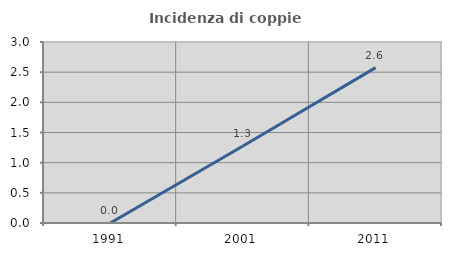
| Category | Incidenza di coppie miste |
|---|---|
| 1991.0 | 0 |
| 2001.0 | 1.277 |
| 2011.0 | 2.575 |